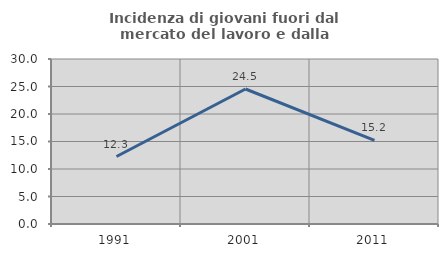
| Category | Incidenza di giovani fuori dal mercato del lavoro e dalla formazione  |
|---|---|
| 1991.0 | 12.269 |
| 2001.0 | 24.542 |
| 2011.0 | 15.207 |